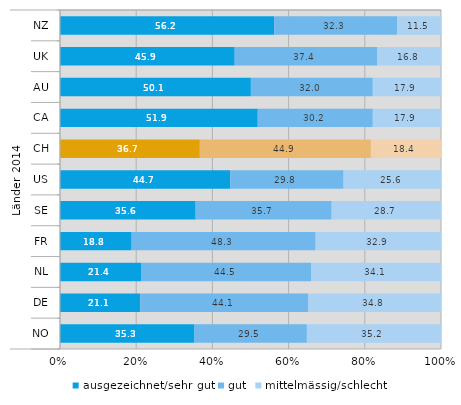
| Category | ausgezeichnet/sehr gut | gut | mittelmässig/schlecht |
|---|---|---|---|
| 0 | 56.2 | 32.3 | 11.5 |
| 1 | 45.9 | 37.4 | 16.8 |
| 2 | 50.1 | 32 | 17.9 |
| 3 | 51.9 | 30.2 | 17.9 |
| 4 | 36.7 | 44.9 | 18.4 |
| 5 | 44.7 | 29.8 | 25.6 |
| 6 | 35.6 | 35.7 | 28.7 |
| 7 | 18.8 | 48.3 | 32.9 |
| 8 | 21.4 | 44.5 | 34.1 |
| 9 | 21.1 | 44.1 | 34.8 |
| 10 | 35.3 | 29.5 | 35.2 |